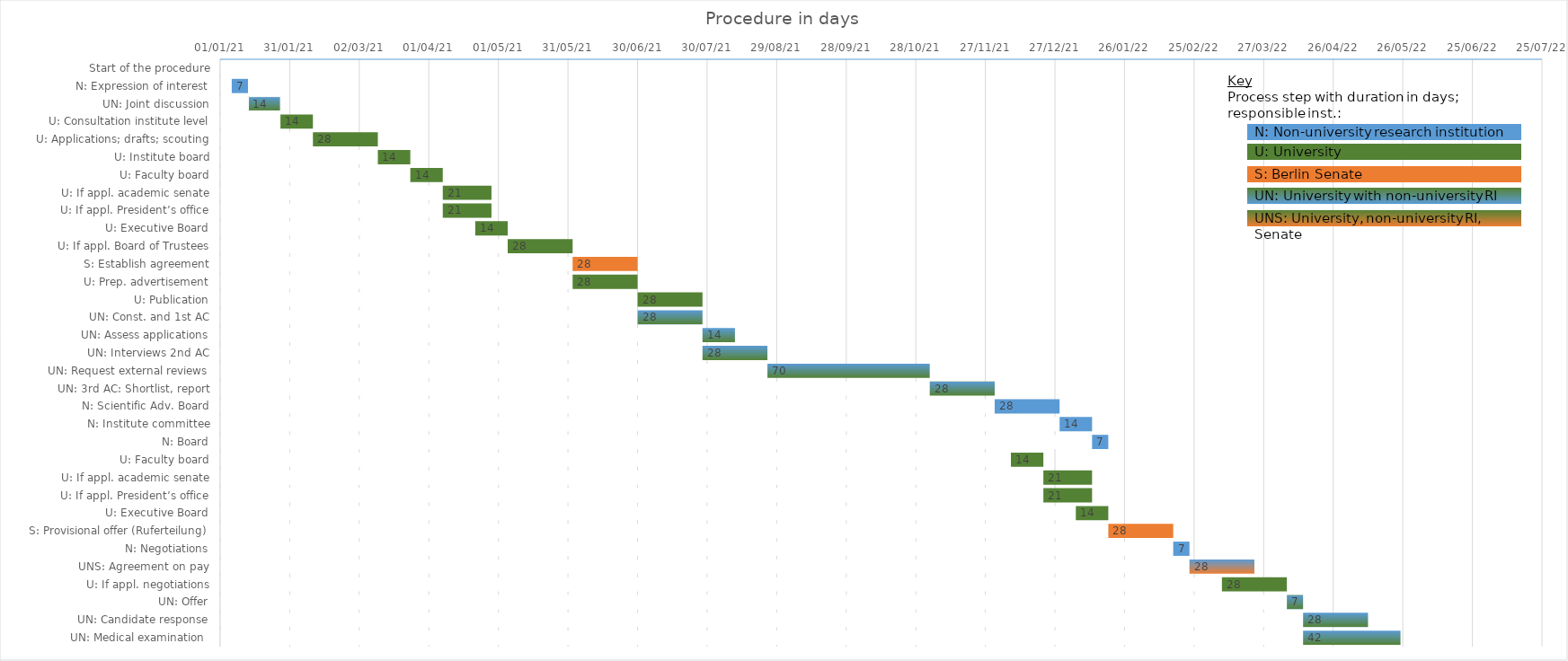
| Category | Start | Duration |
|---|---|---|
| Start of the procedure | 1/6/21 | 0 |
| N: Expression of interest | 1/6/21 | 7 |
| UN: Joint discussion | 1/13/21 | 14 |
| U: Consultation institute level | 1/27/21 | 14 |
| U: Applications; drafts; scouting | 2/10/21 | 28 |
| U: Institute board | 3/10/21 | 14 |
| U: Faculty board | 3/24/21 | 14 |
| U: If appl. academic senate | 4/7/21 | 21 |
| U: If appl. President’s office | 4/7/21 | 21 |
| U: Executive Board | 4/21/21 | 14 |
| U: If appl. Board of Trustees | 5/5/21 | 28 |
| S: Establish agreement | 6/2/21 | 28 |
| U: Prep. advertisement | 6/2/21 | 28 |
| U: Publication | 6/30/21 | 28 |
| UN: Const. and 1st AC | 6/30/21 | 28 |
| UN: Assess applications | 7/28/21 | 14 |
| UN: Interviews 2nd AC | 7/28/21 | 28 |
| UN: Request external reviews | 8/25/21 | 70 |
| UN: 3rd AC: Shortlist, report | 11/3/21 | 28 |
| N: Scientific Adv. Board | 12/1/21 | 28 |
| N: Institute committee | 12/29/21 | 14 |
| N: Board | 1/12/22 | 7 |
| U: Faculty board | 12/8/21 | 14 |
| U: If appl. academic senate | 12/22/21 | 21 |
| U: If appl. President’s office | 12/22/21 | 21 |
| U: Executive Board | 1/5/22 | 14 |
| S: Provisional offer (Ruferteilung) | 1/19/22 | 28 |
| N: Negotiations | 2/16/22 | 7 |
| UNS: Agreement on pay | 2/23/22 | 28 |
| U: If appl. negotiations | 3/9/22 | 28 |
| UN: Offer | 4/6/22 | 7 |
| UN: Candidate response | 4/13/22 | 28 |
| UN: Medical examination  | 4/13/22 | 42 |